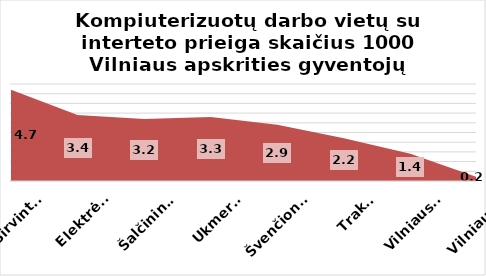
| Category | Series 0 |
|---|---|
| Širvintos | 4.7 |
| Elektrėnai | 3.4 |
| Šalčininkai | 3.2 |
| Ukmergė | 3.3 |
| Švenčionys | 2.9 |
| Trakai | 2.2 |
| Vilniaus r. | 1.4 |
| Vilniaus m. | 0.2 |